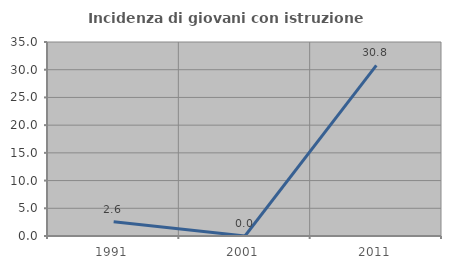
| Category | Incidenza di giovani con istruzione universitaria |
|---|---|
| 1991.0 | 2.564 |
| 2001.0 | 0 |
| 2011.0 | 30.769 |